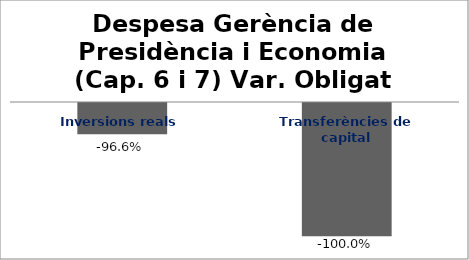
| Category | Series 0 |
|---|---|
| Inversions reals | -0.966 |
| Transferències de capital | -1 |